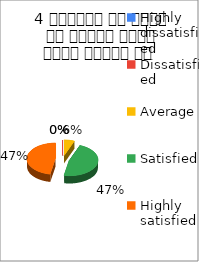
| Category | 4 शिक्षक ने विषय के प्रति रूचि रूचि जागृत की  |
|---|---|
| Highly dissatisfied | 0 |
| Dissatisfied | 0 |
| Average | 2 |
| Satisfied | 16 |
| Highly satisfied | 16 |